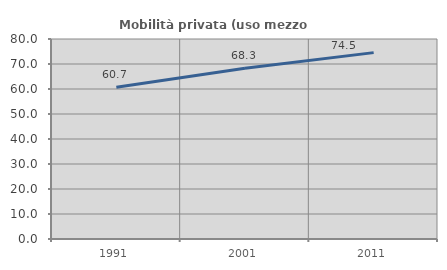
| Category | Mobilità privata (uso mezzo privato) |
|---|---|
| 1991.0 | 60.736 |
| 2001.0 | 68.317 |
| 2011.0 | 74.55 |